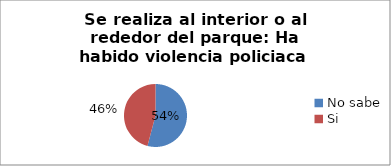
| Category | Series 0 |
|---|---|
| No sabe | 0.541 |
| Si | 0.459 |